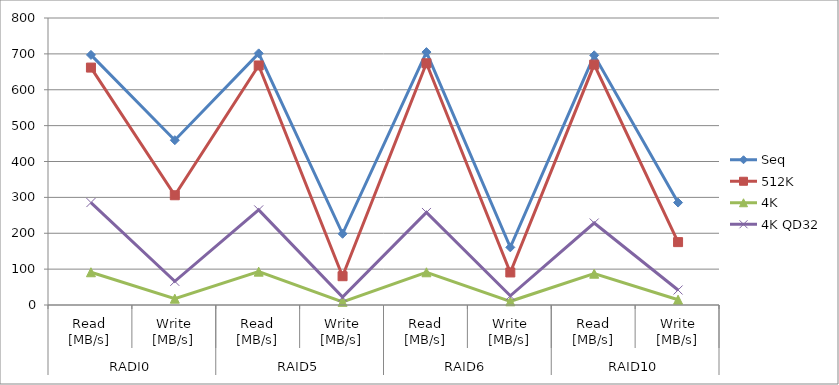
| Category | Seq | 512K | 4K | 4K QD32 |
|---|---|---|---|---|
| 0 | 697.2 | 661.8 | 91.27 | 285.6 |
| 1 | 459.4 | 305.9 | 17.56 | 65.97 |
| 2 | 701.4 | 667.7 | 92.97 | 265.1 |
| 3 | 198.5 | 80.27 | 8.843 | 21.86 |
| 4 | 705 | 673.8 | 91.21 | 257.9 |
| 5 | 160.7 | 90.71 | 10.33 | 25.58 |
| 6 | 696 | 670.1 | 87.27 | 228.5 |
| 7 | 285.5 | 175.3 | 14.76 | 41.78 |